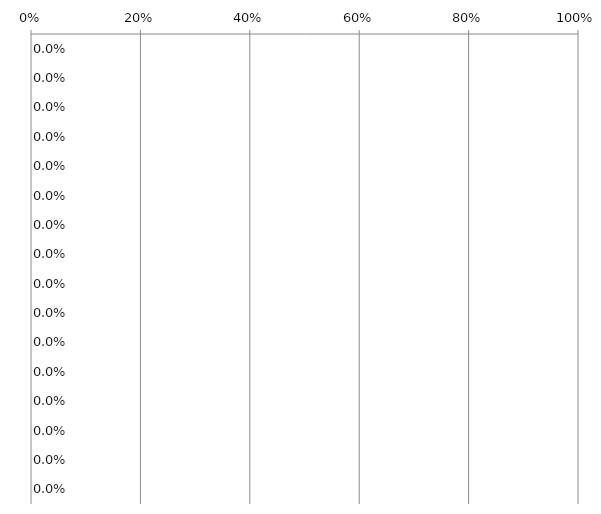
| Category | Series 0 |
|---|---|
| gruppo insegnamento  | 0 |
| gruppo linguistico  | 0 |
| gruppo psicologico  | 0 |
| gruppo letterario  | 0 |
| gruppo geo-biologico   | 0 |
| gruppo medico  | 0 |
| gruppo chimico-farmaceutico | 0 |
| gruppo giuridico  | 0 |
| gruppo politico-sociale  | 0 |
| gruppo architettura | 0 |
| gruppo economico-statistico | 0 |
| gruppo educazione fisica  | 0 |
| gruppo agrario  | 0 |
| gruppo scientifico | 0 |
| gruppo ingegneria | 0 |
| gruppo difesa e sicurezza  | 0 |